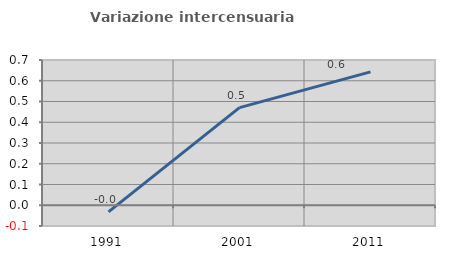
| Category | Variazione intercensuaria annua |
|---|---|
| 1991.0 | -0.032 |
| 2001.0 | 0.471 |
| 2011.0 | 0.643 |